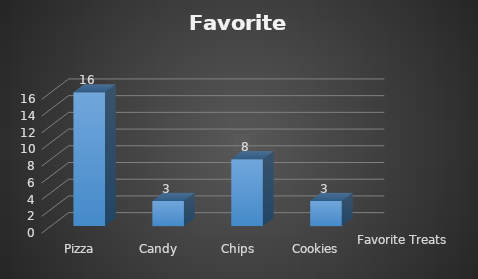
| Category | Favorite Treats |
|---|---|
| Pizza | 16 |
| Candy | 3 |
| Chips | 8 |
| Cookies | 3 |